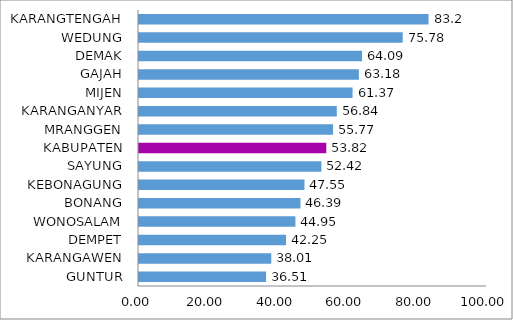
| Category | Series 0 |
|---|---|
| GUNTUR | 36.51 |
| KARANGAWEN | 38.01 |
| DEMPET | 42.25 |
| WONOSALAM | 44.95 |
| BONANG | 46.39 |
| KEBONAGUNG | 47.55 |
| SAYUNG | 52.42 |
| KABUPATEN | 53.82 |
| MRANGGEN | 55.77 |
| KARANGANYAR | 56.84 |
| MIJEN | 61.37 |
| GAJAH | 63.18 |
| DEMAK | 64.09 |
| WEDUNG | 75.78 |
| KARANGTENGAH | 83.2 |